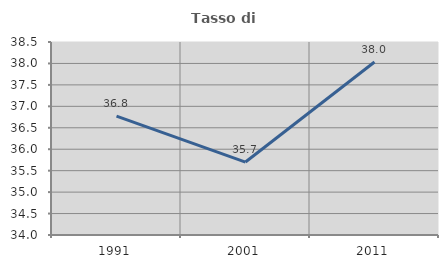
| Category | Tasso di occupazione   |
|---|---|
| 1991.0 | 36.771 |
| 2001.0 | 35.701 |
| 2011.0 | 38.034 |